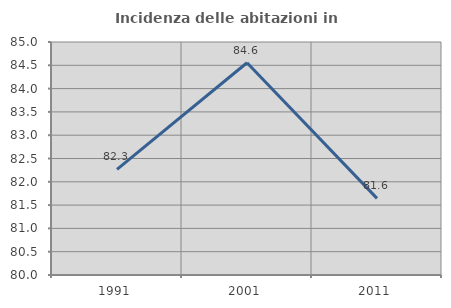
| Category | Incidenza delle abitazioni in proprietà  |
|---|---|
| 1991.0 | 82.266 |
| 2001.0 | 84.555 |
| 2011.0 | 81.644 |